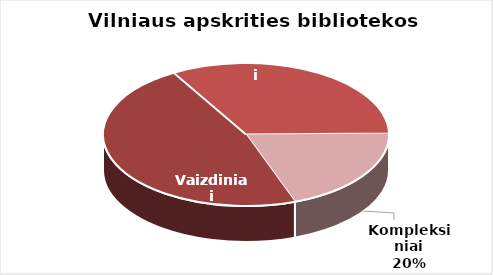
| Category | Series 0 |
|---|---|
| Vaizdiniai | 3882 |
| Žodiniai | 2739 |
| Kompleksiniai | 1619 |